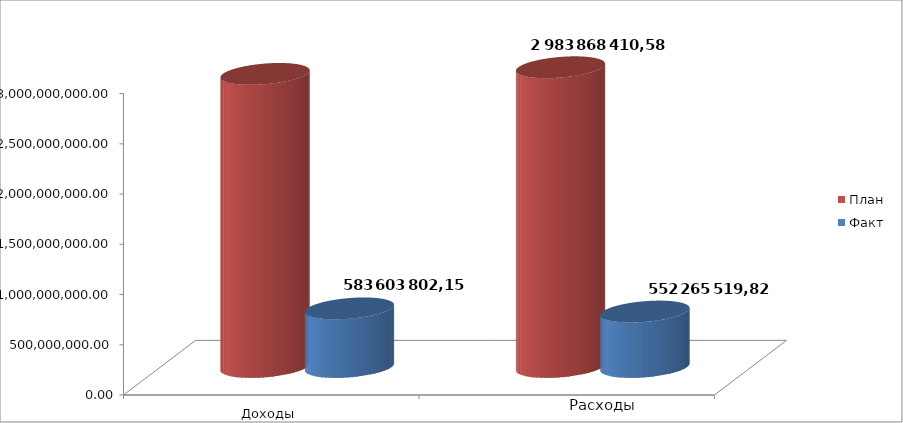
| Category | План | Факт |
|---|---|---|
| 0 | 2917785391.7 | 583603802.15 |
| 1 | 2983868410.58 | 552265519.82 |